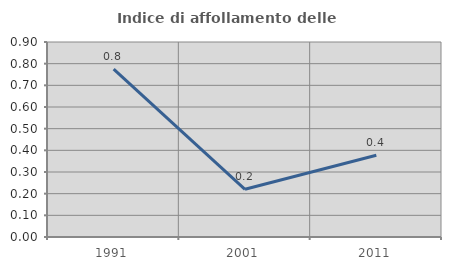
| Category | Indice di affollamento delle abitazioni  |
|---|---|
| 1991.0 | 0.775 |
| 2001.0 | 0.22 |
| 2011.0 | 0.377 |